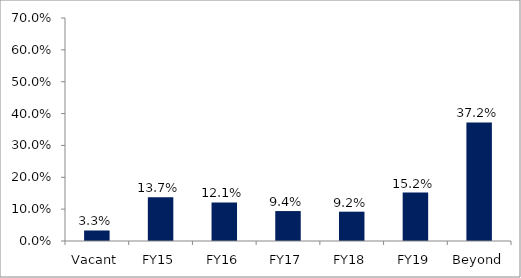
| Category | Series 0 |
|---|---|
| Vacant | 0.033 |
| FY15 | 0.137 |
| FY16 | 0.121 |
| FY17 | 0.094 |
| FY18 | 0.092 |
| FY19 | 0.152 |
| Beyond | 0.372 |